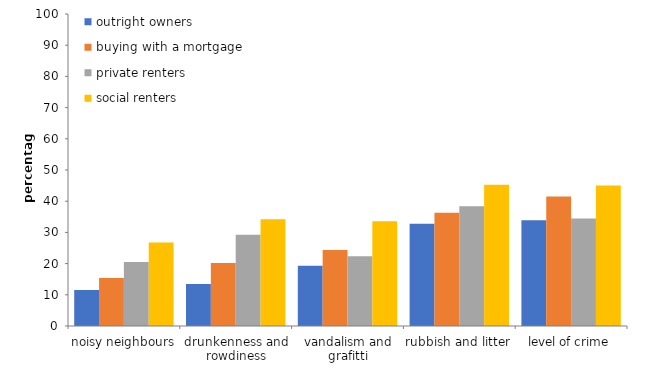
| Category | outright owners | buying with a mortgage | private renters | social renters |
|---|---|---|---|---|
| noisy neighbours | 11.571 | 15.405 | 20.531 | 26.726 |
| drunkenness and rowdiness | 13.423 | 20.198 | 29.226 | 34.199 |
| vandalism and grafitti | 19.325 | 24.393 | 22.362 | 33.545 |
| rubbish and litter | 32.792 | 36.301 | 38.388 | 45.272 |
| level of crime | 33.918 | 41.476 | 34.43 | 45.064 |